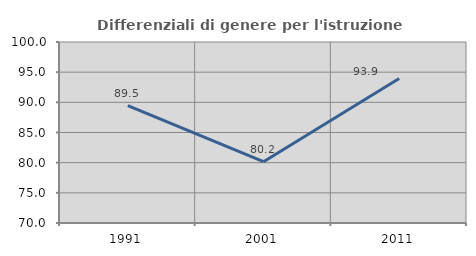
| Category | Differenziali di genere per l'istruzione superiore |
|---|---|
| 1991.0 | 89.464 |
| 2001.0 | 80.164 |
| 2011.0 | 93.936 |